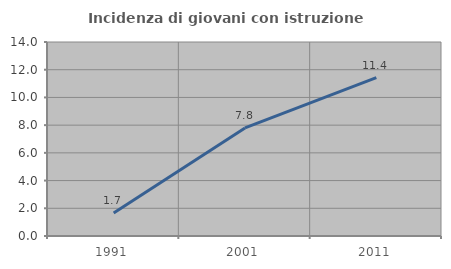
| Category | Incidenza di giovani con istruzione universitaria |
|---|---|
| 1991.0 | 1.667 |
| 2001.0 | 7.801 |
| 2011.0 | 11.429 |